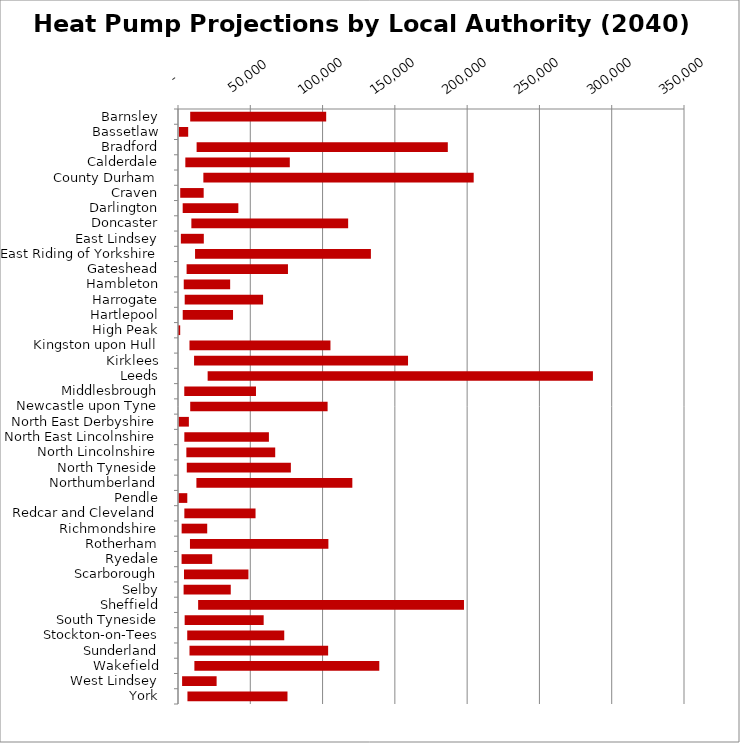
| Category | MIN | MAX |
|---|---|---|
| Barnsley | 8443 | 94059 |
| Bassetlaw | 644 | 6408 |
| Bradford | 12879 | 173743 |
| Calderdale | 5072 | 72261 |
| County Durham | 17542 | 186987 |
| Craven | 1540 | 16220 |
| Darlington | 3244 | 38497 |
| Doncaster | 9245 | 108450 |
| East Lindsey | 1973 | 15879 |
| East Riding of Yorkshire | 11799 | 121631 |
| Gateshead | 5948 | 70113 |
| Hambleton | 3979 | 32096 |
| Harrogate | 4638 | 54211 |
| Hartlepool | 3264 | 34804 |
| High Peak | 170 | 1353 |
| Kingston upon Hull | 7942 | 97511 |
| Kirklees | 11116 | 147995 |
| Leeds | 20505 | 266496 |
| Middlesbrough | 4337 | 49605 |
| Newcastle upon Tyne | 8451 | 95026 |
| North East Derbyshire | 491 | 7029 |
| North East Lincolnshire | 4385 | 58495 |
| North Lincolnshire | 5780 | 61462 |
| North Tyneside | 6071 | 72000 |
| Northumberland | 12734 | 107852 |
| Pendle | 441 | 5986 |
| Redcar and Cleveland | 4390 | 49245 |
| Richmondshire | 2512 | 17693 |
| Rotherham | 8271 | 95753 |
| Ryedale | 2472 | 21177 |
| Scarborough | 4151 | 44565 |
| Selby | 3877 | 32617 |
| Sheffield | 13931 | 183879 |
| South Tyneside | 4605 | 54651 |
| Stockton-on-Tees | 6383 | 67110 |
| Sunderland | 7955 | 95892 |
| Wakefield | 11332 | 127902 |
| West Lindsey | 2839 | 23874 |
| York | 6534 | 69195 |